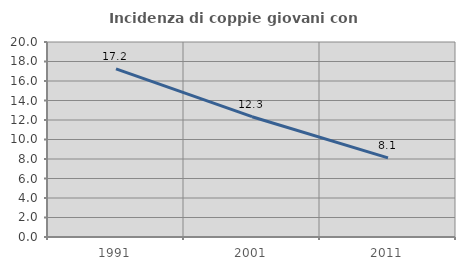
| Category | Incidenza di coppie giovani con figli |
|---|---|
| 1991.0 | 17.235 |
| 2001.0 | 12.339 |
| 2011.0 | 8.122 |